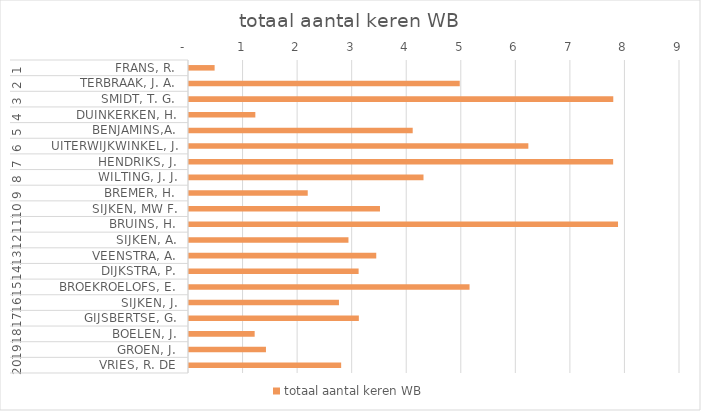
| Category | totaal aantal keren WB |
|---|---|
| 0 | 0.47 |
| 1 | 4.963 |
| 2 | 7.777 |
| 3 | 1.216 |
| 4 | 4.1 |
| 5 | 6.22 |
| 6 | 7.775 |
| 7 | 4.298 |
| 8 | 2.176 |
| 9 | 3.501 |
| 10 | 7.864 |
| 11 | 2.923 |
| 12 | 3.432 |
| 13 | 3.109 |
| 14 | 5.142 |
| 15 | 2.749 |
| 16 | 3.113 |
| 17 | 1.204 |
| 18 | 1.411 |
| 19 | 2.789 |